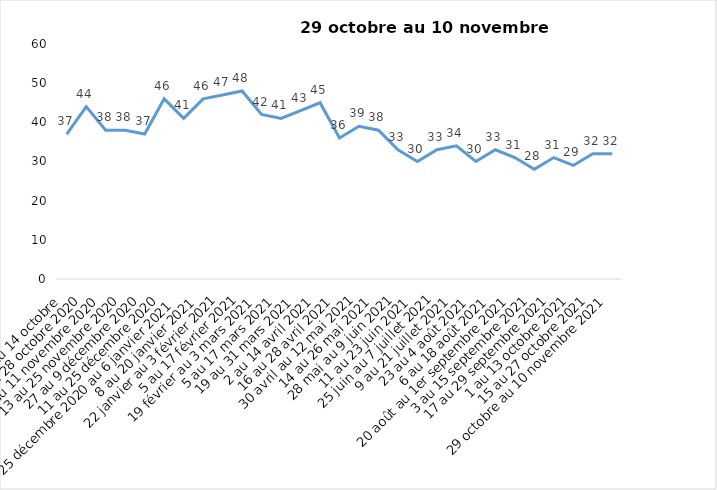
| Category | Toujours aux trois mesures |
|---|---|
| 2 au 14 octobre  | 37 |
| 16 au 28 octobre 2020 | 44 |
| 30 octobre au 11 novembre 2020 | 38 |
| 13 au 25 novembre 2020 | 38 |
| 27 au 9 décembre 2020 | 37 |
| 11 au 25 décembre 2020 | 46 |
| 25 décembre 2020 au 6 janvier 2021 | 41 |
| 8 au 20 janvier 2021 | 46 |
| 22 janvier au 3 février 2021 | 47 |
| 5 au 17 février 2021 | 48 |
| 19 février au 3 mars 2021 | 42 |
| 5 au 17 mars 2021 | 41 |
| 19 au 31 mars 2021 | 43 |
| 2 au 14 avril 2021 | 45 |
| 16 au 28 avril 2021 | 36 |
| 30 avril au 12 mai 2021 | 39 |
| 14 au 26 mai 2021 | 38 |
| 28 mai au 9 juin 2021 | 33 |
| 11 au 23 juin 2021 | 30 |
| 25 juin au 7 juillet 2021 | 33 |
| 9 au 21 juillet 2021 | 34 |
| 23 au 4 août 2021 | 30 |
| 6 au 18 août 2021 | 33 |
| 20 août au 1er septembre 2021 | 31 |
| 3 au 15 septembre 2021 | 28 |
| 17 au 29 septembre 2021 | 31 |
| 1 au 13 octobre 2021 | 29 |
| 15 au 27 octobre 2021 | 32 |
| 29 octobre au 10 novembre 2021 | 32 |